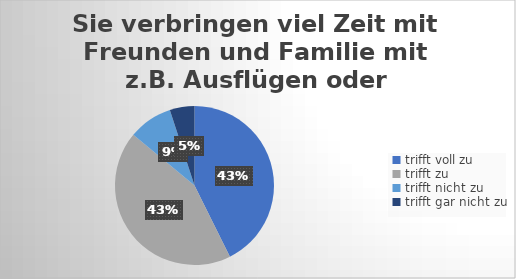
| Category | Sie verbringen viel Zeit mit Freunden und Familie mit z.B. Ausflügen oder Aktivitäten |
|---|---|
| trifft voll zu | 119 |
| trifft zu  | 121 |
| trifft nicht zu  | 25 |
| trifft gar nicht zu | 14 |